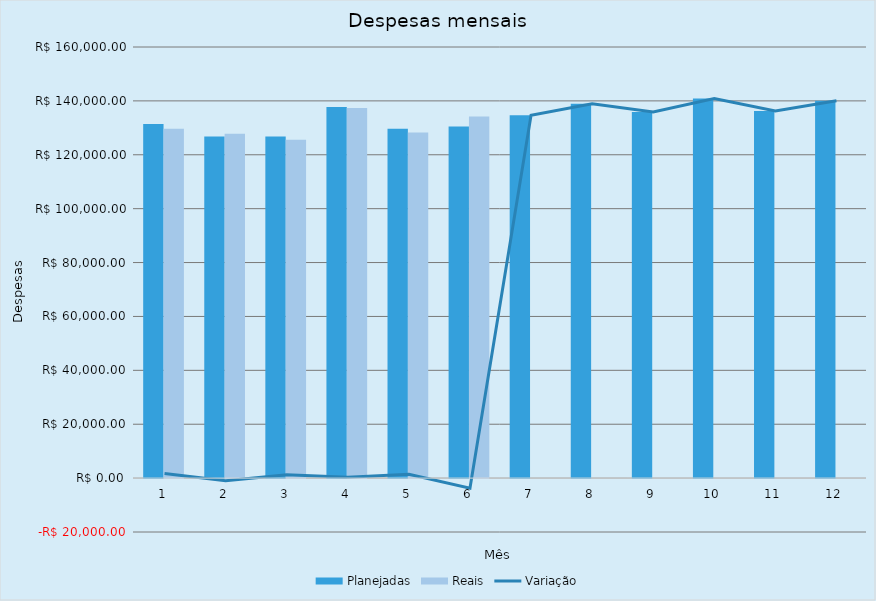
| Category | Planejadas | Reais |
|---|---|---|
| 0 | 131420 | 129682 |
| 1 | 126820 | 127804 |
| 2 | 126820 | 125565 |
| 3 | 137695 | 137394 |
| 4 | 129695 | 128255 |
| 5 | 130495 | 134239 |
| 6 | 134695 | 0 |
| 7 | 138918 | 0 |
| 8 | 135918 | 0 |
| 9 | 140918 | 0 |
| 10 | 136218 | 0 |
| 11 | 140018 | 0 |